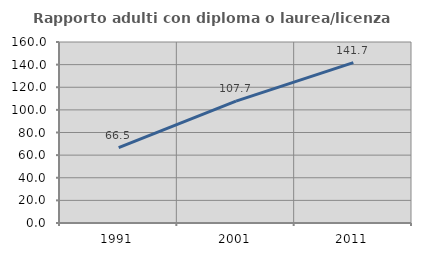
| Category | Rapporto adulti con diploma o laurea/licenza media  |
|---|---|
| 1991.0 | 66.538 |
| 2001.0 | 107.74 |
| 2011.0 | 141.722 |